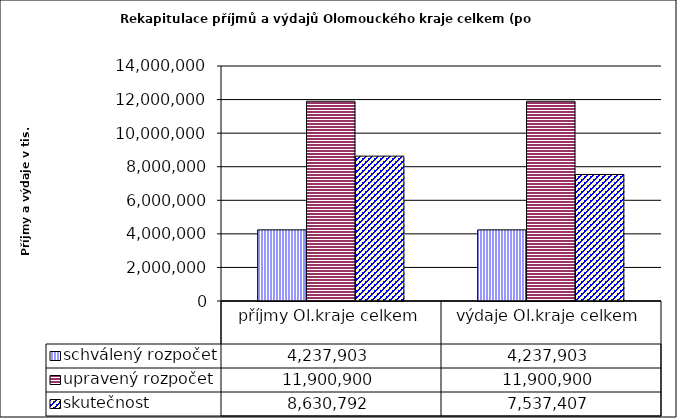
| Category | schválený rozpočet | upravený rozpočet | skutečnost |
|---|---|---|---|
| příjmy Ol.kraje celkem | 4237903 | 11900900 | 8630792 |
| výdaje Ol.kraje celkem | 4237903 | 11900900 | 7537407 |